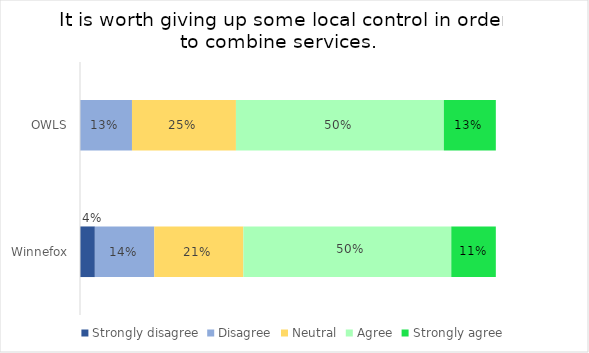
| Category | Strongly disagree | Disagree | Neutral | Agree | Strongly agree |
|---|---|---|---|---|---|
| OWLS | 0 | 0.125 | 0.25 | 0.5 | 0.125 |
| Winnefox | 0.036 | 0.143 | 0.214 | 0.5 | 0.107 |